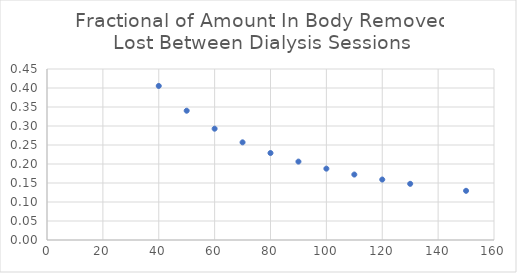
| Category | Series 0 |
|---|---|
| 40.0 | 0.405 |
| 50.0 | 0.34 |
| 60.0 | 0.293 |
| 70.0 | 0.257 |
| 80.0 | 0.229 |
| 90.0 | 0.206 |
| 100.0 | 0.188 |
| 110.0 | 0.172 |
| 120.0 | 0.159 |
| 130.0 | 0.148 |
| 150.0 | 0.129 |